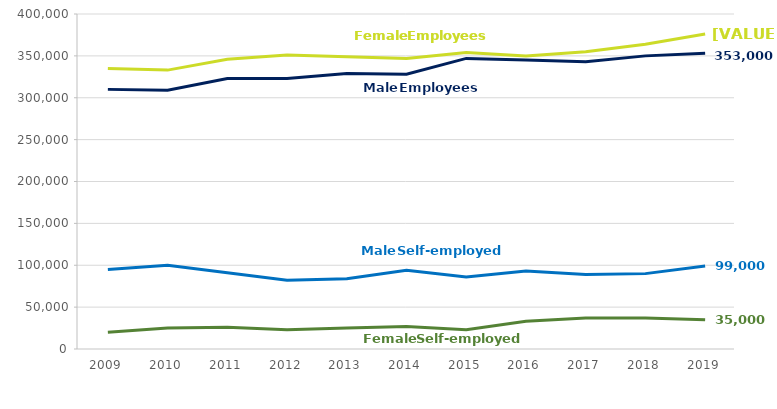
| Category | Male Employees | Male Self-employed | Female Employees | Female Self-employed |
|---|---|---|---|---|
| 2009.0 | 310000 | 95000 | 335000 | 20000 |
| 2010.0 | 309000 | 100000 | 333000 | 25000 |
| 2011.0 | 323000 | 91000 | 346000 | 26000 |
| 2012.0 | 323000 | 82000 | 351000 | 23000 |
| 2013.0 | 329000 | 84000 | 349000 | 25000 |
| 2014.0 | 328000 | 94000 | 347000 | 27000 |
| 2015.0 | 347000 | 86000 | 354000 | 23000 |
| 2016.0 | 345000 | 93000 | 350000 | 33000 |
| 2017.0 | 343000 | 89000 | 355000 | 37000 |
| 2018.0 | 350000 | 90000 | 364000 | 37000 |
| 2019.0 | 353000 | 99000 | 376000 | 35000 |